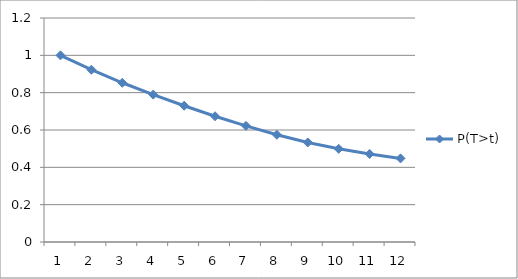
| Category | P(T>t) |
|---|---|
| 0 | 1 |
| 1 | 0.923 |
| 2 | 0.853 |
| 3 | 0.79 |
| 4 | 0.73 |
| 5 | 0.674 |
| 6 | 0.622 |
| 7 | 0.574 |
| 8 | 0.533 |
| 9 | 0.499 |
| 10 | 0.472 |
| 11 | 0.448 |